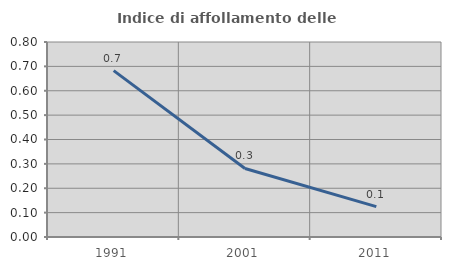
| Category | Indice di affollamento delle abitazioni  |
|---|---|
| 1991.0 | 0.683 |
| 2001.0 | 0.281 |
| 2011.0 | 0.125 |